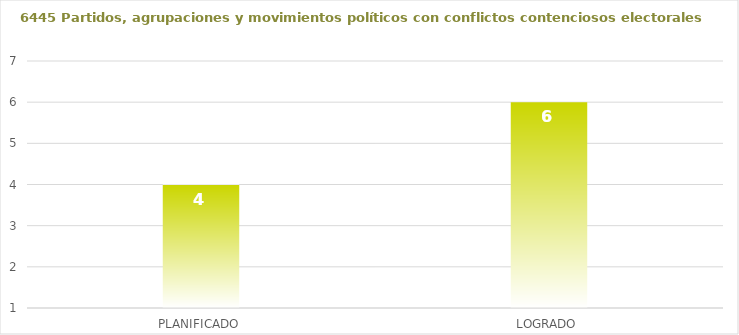
| Category | 6445 |
|---|---|
| PLANIFICADO | 4 |
| LOGRADO | 6 |